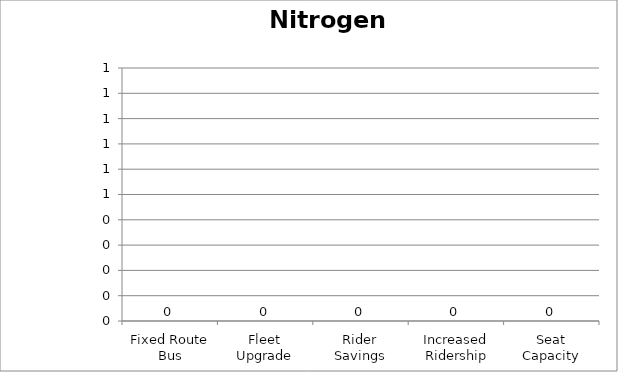
| Category | Nitrogen Oxides |
|---|---|
| Fixed Route Bus | 0 |
| Fleet Upgrade | 0 |
| Rider Savings | 0 |
| Increased Ridership | 0 |
| Seat Capacity | 0 |